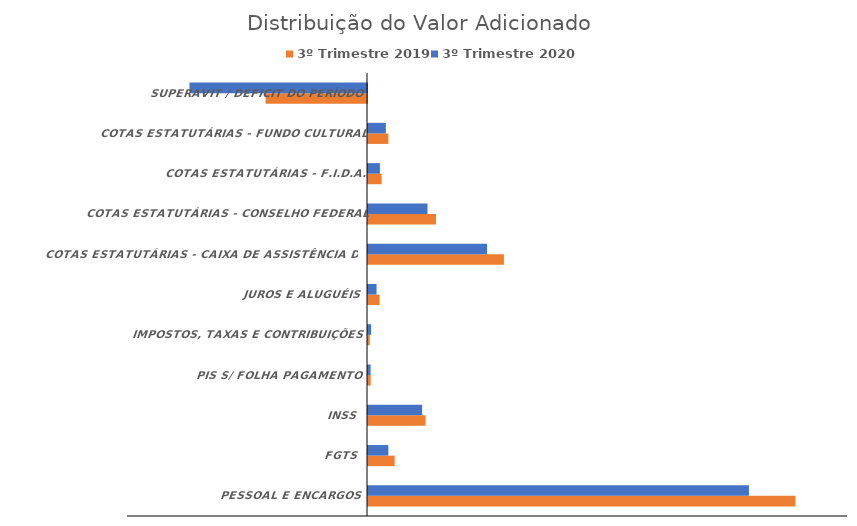
| Category | 3º Trimestre 2019 | 3º Trimestre 2020 |
|---|---|---|
| PESSOAL E ENCARGOS | 5342881.32 | 4761663.98 |
| FGTS | 332798.99 | 254448.72 |
| INSS | 719751.59 | 676420.46 |
| PIS S/ FOLHA PAGAMENTO | 33650.11 | 32233.24 |
| IMPOSTOS, TAXAS E CONTRIBUIÇÕES | 22476.7 | 38667.63 |
| JUROS E ALUGUÉIS | 144744.68 | 106821.86 |
| COTAS ESTATUTÁRIAS - CAIXA DE ASSISTÊNCIA DOS ADVOGADOS | 1699066.86 | 1487767.14 |
| COTAS ESTATUTÁRIAS - CONSELHO FEDERAL | 849533.43 | 743874.52 |
| COTAS ESTATUTÁRIAS - F.I.D.A. | 169906.68 | 148774.91 |
| COTAS ESTATUTÁRIAS - FUNDO CULTURAL | 254860.02 | 223162.36 |
| SUPERAVIT / DEFICIT DO PERÍODO | -1267411.55 | -2219177.62 |